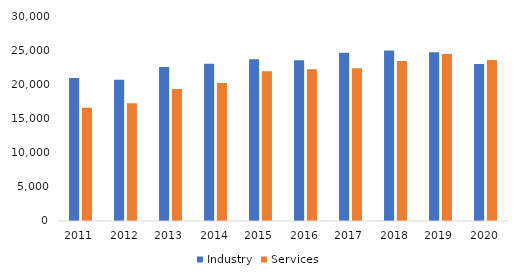
| Category | Industry | Services |
|---|---|---|
| 2011.0 | 20939 | 16565 |
| 2012.0 | 20686 | 17237 |
| 2013.0 | 22520 | 19313 |
| 2014.0 | 23007 | 20192 |
| 2015.0 | 23671 | 21906 |
| 2016.0 | 23512 | 22221 |
| 2017.0 | 24631 | 22351 |
| 2018.0 | 24935 | 23427 |
| 2019.0 | 24697 | 24454 |
| 2020.0 | 22970 | 23551 |